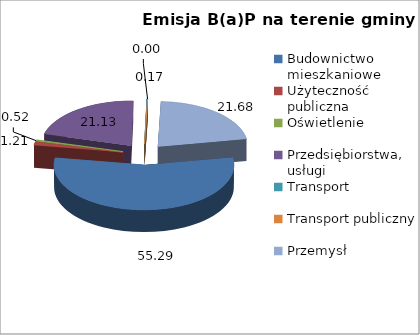
| Category | 55,29 1,21 0,52 21,13 0,17 0,00 21,68 |
|---|---|
| Budownictwo mieszkaniowe | 55.294 |
| Użyteczność publiczna | 1.213 |
| Oświetlenie | 0.52 |
| Przedsiębiorstwa, usługi | 21.126 |
| Transport | 0.165 |
| Transport publiczny | 0.001 |
| Przemysł | 21.681 |